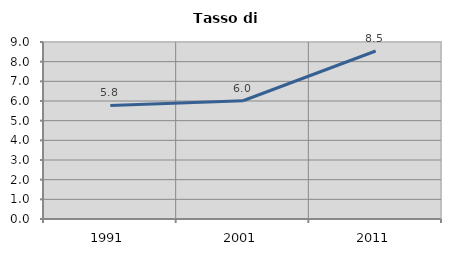
| Category | Tasso di disoccupazione   |
|---|---|
| 1991.0 | 5.773 |
| 2001.0 | 6.014 |
| 2011.0 | 8.541 |